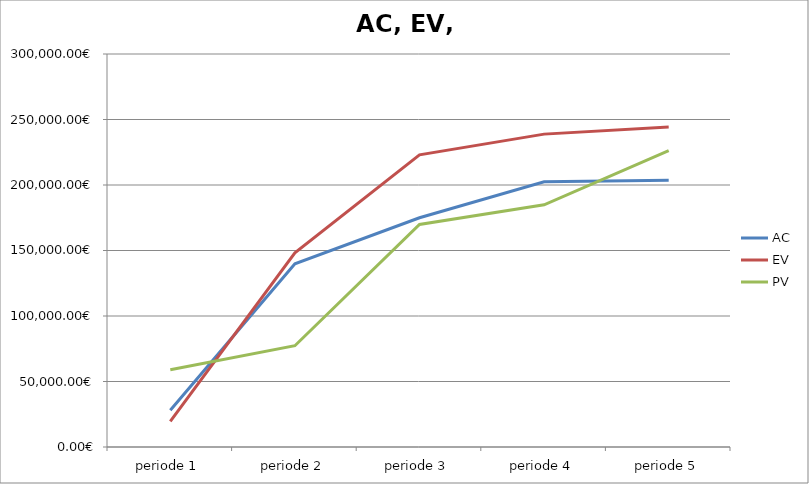
| Category | AC | EV | PV |
|---|---|---|---|
| periode 1 | 27993.22 | 19535.435 | 58945.799 |
| periode 2 | 139833.199 | 148260.592 | 77310.599 |
| periode 3 | 175005.51 | 222987.716 | 169889.957 |
| periode 4 | 202522.54 | 238834.357 | 184870.437 |
| periode 5 | 203605.97 | 244205.397 | 226158.917 |